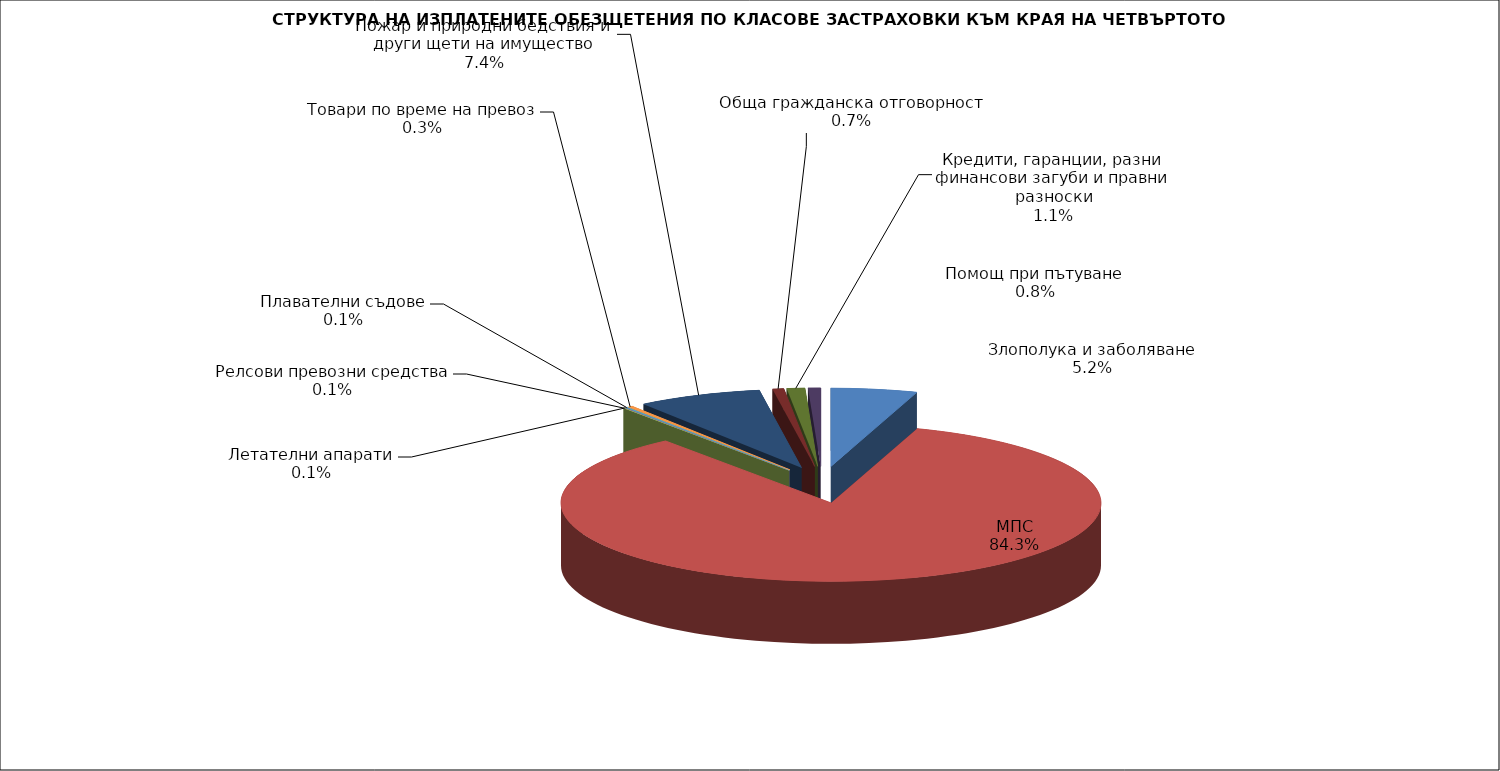
| Category | Злополука и заболяване |
|---|---|
| Злополука и заболяване | 0.052 |
| МПС | 0.843 |
| Релсови превозни средства | 0.001 |
| Летателни апарати | 0.001 |
| Плавателни съдове | 0.001 |
| Товари по време на превоз | 0.003 |
| Пожар и природни бедствия и други щети на имущество | 0.074 |
| Обща гражданска отговорност | 0.007 |
| Кредити, гаранции, разни финансови загуби и правни разноски | 0.011 |
| Помощ при пътуване | 0.008 |